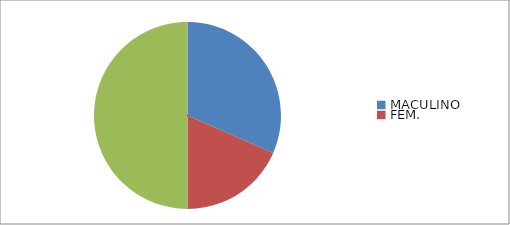
| Category | TOTAL  |
|---|---|
| MACULINO  | 296 |
| FEM. | 173 |
| TOTAL  | 469 |